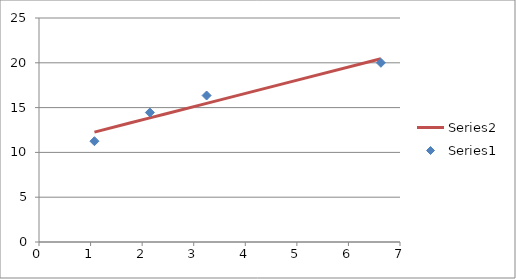
| Category | Series 1 |
|---|---|
| 1.0750000000000002 | 12.266 |
| 2.1500000000000004 | 13.851 |
| 3.25 | 15.474 |
| 6.63 | 20.459 |